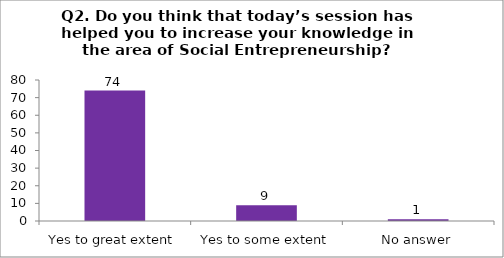
| Category | Q2. Do you think that today’s session have helped you to increase your knowledge in the area of Social Entrepreneurship? |
|---|---|
| Yes to great extent | 74 |
| Yes to some extent | 9 |
| No answer | 1 |